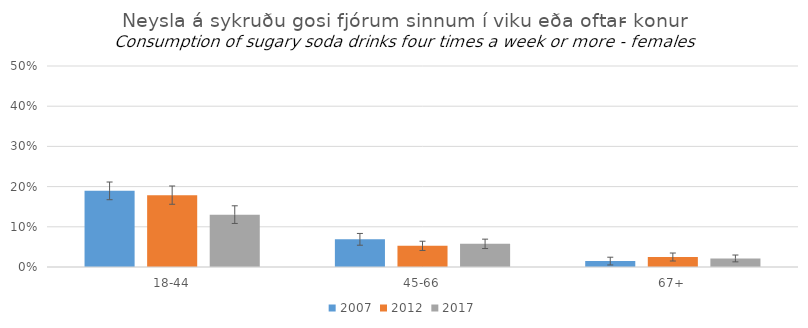
| Category | 2007 | 2012 | 2017 |
|---|---|---|---|
| 18-44 | 0.189 | 0.179 | 0.13 |
| 45-66 | 0.069 | 0.053 | 0.058 |
| 67+ | 0.015 | 0.025 | 0.021 |